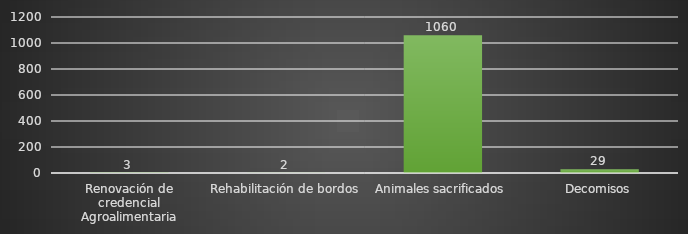
| Category | INDICADOR  |
|---|---|
| Renovación de credencial Agroalimentaria | 3 |
| Rehabilitación de bordos | 2 |
| Animales sacrificados | 1060 |
| Decomisos | 29 |